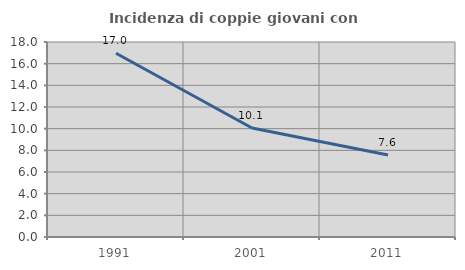
| Category | Incidenza di coppie giovani con figli |
|---|---|
| 1991.0 | 16.963 |
| 2001.0 | 10.057 |
| 2011.0 | 7.565 |